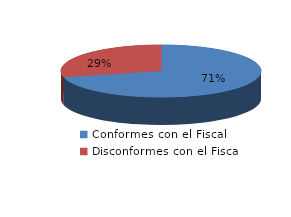
| Category | Series 0 |
|---|---|
| 0 | 2019 |
| 1 | 817 |